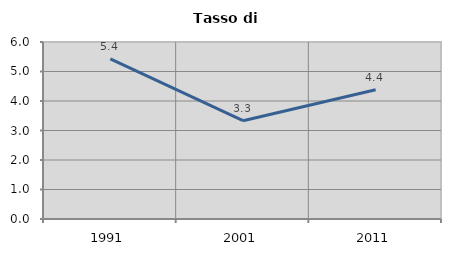
| Category | Tasso di disoccupazione   |
|---|---|
| 1991.0 | 5.429 |
| 2001.0 | 3.333 |
| 2011.0 | 4.381 |